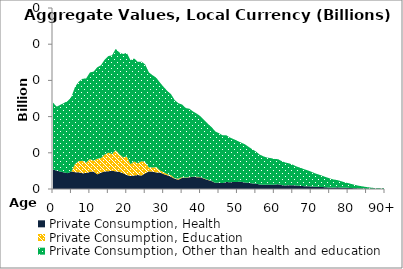
| Category | Private Consumption, Health | Private Consumption, Education | Private Consumption, Other than health and education |
|---|---|---|---|
| 0 | 26.926 | 0 | 92.34 |
|  | 25.435 | 0 | 88.326 |
| 2 | 24.093 | 0 | 92.27 |
| 3 | 22.883 | 0 | 96.023 |
| 4 | 21.86 | 0 | 99.636 |
| 5 | 24.315 | 0 | 103.148 |
| 6 | 23.198 | 11.581 | 106.583 |
| 7 | 23.111 | 15.259 | 109.95 |
| 8 | 21.846 | 17.128 | 113.245 |
| 9 | 21.999 | 14.328 | 116.452 |
| 10 | 23.623 | 17.732 | 119.614 |
| 11 | 24.064 | 15.203 | 122.846 |
| 12 | 20.314 | 21.592 | 126.21 |
| 13 | 22.526 | 20.102 | 128.279 |
| 14 | 24.27 | 23.317 | 131.002 |
| 15 | 24.514 | 25.714 | 133.45 |
| 16 | 25.26 | 23.037 | 136.24 |
| 17 | 24.358 | 29.293 | 139.875 |
| 18 | 23.643 | 24.14 | 140.847 |
| 19 | 21.77 | 22.003 | 142.707 |
| 20 | 19.42 | 25.597 | 143.052 |
| 21 | 17.803 | 16.502 | 143.577 |
| 22 | 18.709 | 19.353 | 142.263 |
| 23 | 19.292 | 16.206 | 140.066 |
| 24 | 18.638 | 19.866 | 137.484 |
| 25 | 21.717 | 15.41 | 134.789 |
| 26 | 24.385 | 5.292 | 131.509 |
| 27 | 23.954 | 5.792 | 127.327 |
| 28 | 22.899 | 7.24 | 123.608 |
| 29 | 22.828 | 2.748 | 121.405 |
| 30 | 20.613 | 2.672 | 117.655 |
| 31 | 18.908 | 1.516 | 114.953 |
| 32 | 17.08 | 1.983 | 111.865 |
| 33 | 14.042 | 0.789 | 107.932 |
| 34 | 12.911 | 1.336 | 104.236 |
| 35 | 15.519 | 0.854 | 100.327 |
| 36 | 15.175 | 0.522 | 96.156 |
| 37 | 16.307 | 0.309 | 94.195 |
| 38 | 16.621 | 0.256 | 90.108 |
| 39 | 16.324 | 0.528 | 87.189 |
| 40 | 16.304 | 0.324 | 83.745 |
| 41 | 14.136 | 0.527 | 80.412 |
| 42 | 12.337 | 0.445 | 77.262 |
| 43 | 10.945 | 0.325 | 74.2 |
| 44 | 8.46 | 0 | 71.13 |
| 45 | 8.641 | 0 | 68.448 |
| 46 | 8.229 | 0 | 65.836 |
| 47 | 9.592 | 0 | 64.557 |
| 48 | 9.356 | 0 | 61.658 |
| 49 | 9.609 | 0 | 59.192 |
| 50 | 9.835 | 0 | 56.743 |
| 51 | 9.865 | 0 | 54.191 |
| 52 | 9.034 | 0 | 52.797 |
| 53 | 8.409 | 0 | 49.953 |
| 54 | 7.739 | 0 | 47.168 |
| 55 | 7.342 | 0 | 44.531 |
| 56 | 6.235 | 0 | 41.383 |
| 57 | 5.895 | 0 | 39.319 |
| 58 | 5.81 | 0 | 37.66 |
| 59 | 5.876 | 0 | 36.796 |
| 60 | 6.016 | 0 | 35.555 |
| 61 | 6.581 | 0 | 34.594 |
| 62 | 5.366 | 0 | 33.226 |
| 63 | 4.811 | 0 | 31.727 |
| 64 | 5.316 | 0 | 30.115 |
| 65 | 5.238 | 0 | 28.367 |
| 66 | 4.789 | 0 | 26.368 |
| 67 | 4.305 | 0 | 25.214 |
| 68 | 3.943 | 0 | 23.543 |
| 69 | 3.84 | 0 | 22.009 |
| 70 | 3.494 | 0 | 20.422 |
| 71 | 2.972 | 0 | 18.764 |
| 72 | 2.949 | 0 | 17.072 |
| 73 | 2.736 | 0 | 15.554 |
| 74 | 2.34 | 0 | 14.048 |
| 75 | 2.063 | 0 | 12.603 |
| 76 | 1.848 | 0 | 11.321 |
| 77 | 2.322 | 0 | 10.137 |
| 78 | 2.075 | 0 | 8.857 |
| 79 | 1.642 | 0 | 7.682 |
| 80 | 1.621 | 0 | 6.566 |
| 81 | 1.271 | 0 | 5.506 |
| 82 | 1.045 | 0 | 4.454 |
| 83 | 0.78 | 0 | 3.588 |
| 84 | 0.662 | 0 | 2.86 |
| 85 | 0.464 | 0 | 2.221 |
| 86 | 0.321 | 0 | 1.667 |
| 87 | 0.228 | 0 | 1.221 |
| 88 | 0.16 | 0 | 0.885 |
| 89 | 0.118 | 0 | 0.637 |
| 90+ | 0.22 | 0 | 1.31 |